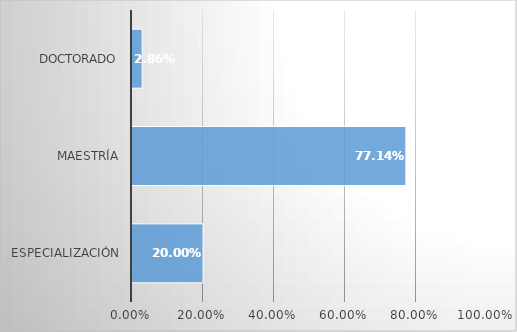
| Category | Series 0 |
|---|---|
| Especialización | 0.2 |
| Maestría | 0.771 |
| Doctorado | 0.029 |